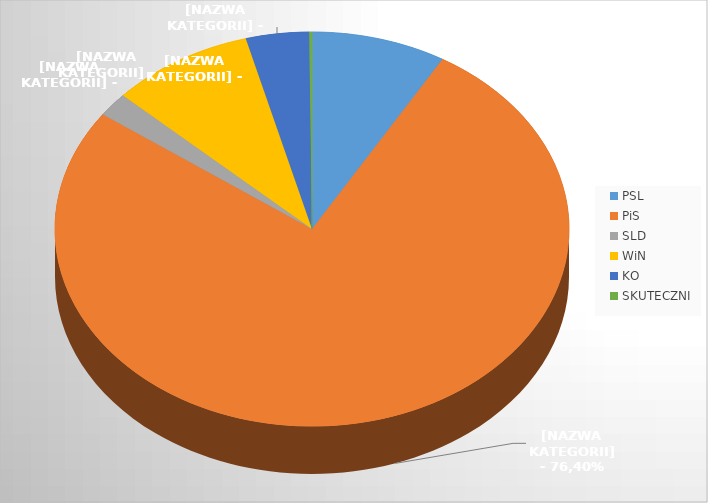
| Category | Series 0 |
|---|---|
| PSL | 47 |
| PiS | 424 |
| SLD | 11 |
| WiN | 50 |
| KO | 22 |
| SKUTECZNI | 1 |